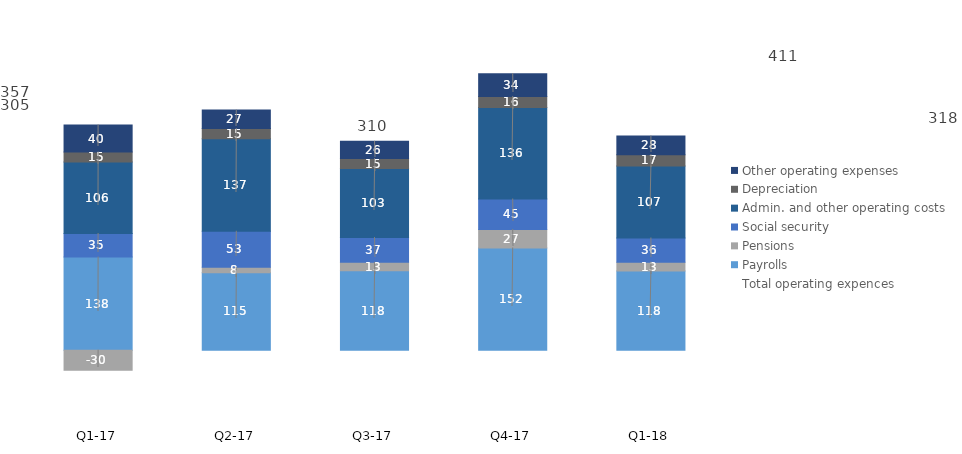
| Category | Payrolls | Pensions | Social security | Admin. and other operating costs | Depreciation | Other operating expenses |
|---|---|---|---|---|---|---|
| Q1-18 | 117.7 | 13 | 35.9 | 107 | 16.7 | 27.8 |
| Q4-17 | 151.8 | 27.4 | 45.2 | 136 | 16.4 | 33.9 |
| Q3-17 | 117.8 | 12.6 | 36.8 | 102.6 | 14.8 | 25.6 |
| Q2-17 | 114.9 | 8.4 | 53.3 | 137.4 | 15.1 | 27.4 |
| Q1-17 | 138.3 | -29.7 | 34.9 | 106.3 | 14.8 | 40.1 |